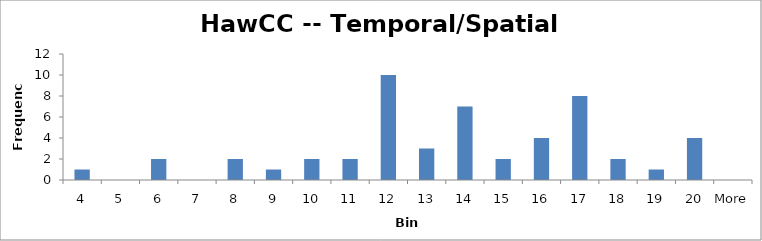
| Category | Frequency |
|---|---|
| 4 | 1 |
| 5 | 0 |
| 6 | 2 |
| 7 | 0 |
| 8 | 2 |
| 9 | 1 |
| 10 | 2 |
| 11 | 2 |
| 12 | 10 |
| 13 | 3 |
| 14 | 7 |
| 15 | 2 |
| 16 | 4 |
| 17 | 8 |
| 18 | 2 |
| 19 | 1 |
| 20 | 4 |
| More | 0 |